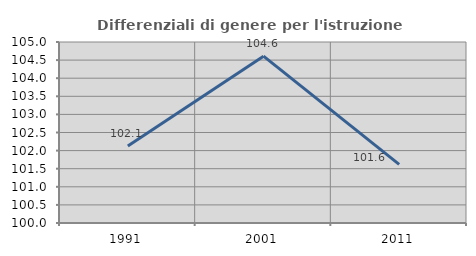
| Category | Differenziali di genere per l'istruzione superiore |
|---|---|
| 1991.0 | 102.127 |
| 2001.0 | 104.609 |
| 2011.0 | 101.62 |